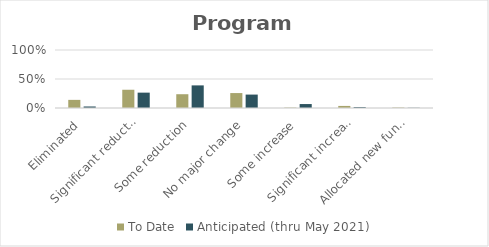
| Category | To Date | Anticipated (thru May 2021) |
|---|---|---|
| Eliminated | 0.14 | 0.026 |
| Significant reduction | 0.315 | 0.265 |
| Some reduction | 0.238 | 0.39 |
| No major change | 0.257 | 0.231 |
| Some increase | 0.007 | 0.068 |
| Significant increase | 0.036 | 0.016 |
| Allocated new funding | 0.008 | 0.004 |